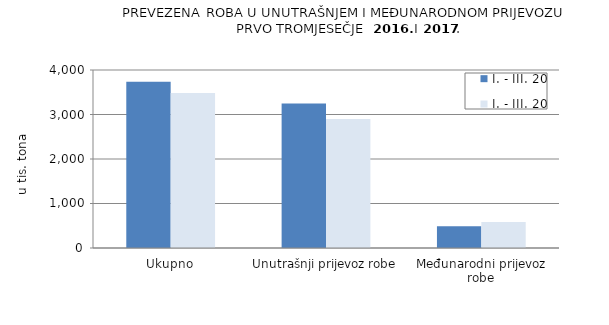
| Category | I. - III. 2016. | I. - III. 2017. |
|---|---|---|
| Ukupno | 3737 | 3481 |
| Unutrašnji prijevoz robe | 3246 | 2899 |
| Međunarodni prijevoz robe | 491 | 582 |